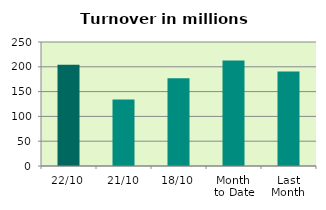
| Category | Series 0 |
|---|---|
| 22/10 | 204.125 |
| 21/10 | 134.003 |
| 18/10 | 177.074 |
| Month 
to Date | 212.677 |
| Last
Month | 190.73 |